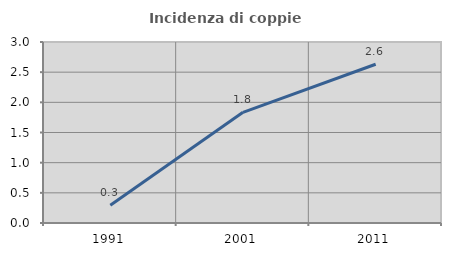
| Category | Incidenza di coppie miste |
|---|---|
| 1991.0 | 0.293 |
| 2001.0 | 1.835 |
| 2011.0 | 2.632 |